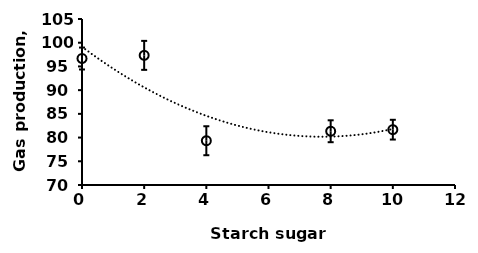
| Category | Series 0 |
|---|---|
| 0.0 | 96.667 |
| 2.0 | 97.333 |
| 4.0 | 79.333 |
| 8.0 | 81.333 |
| 10.0 | 81.667 |